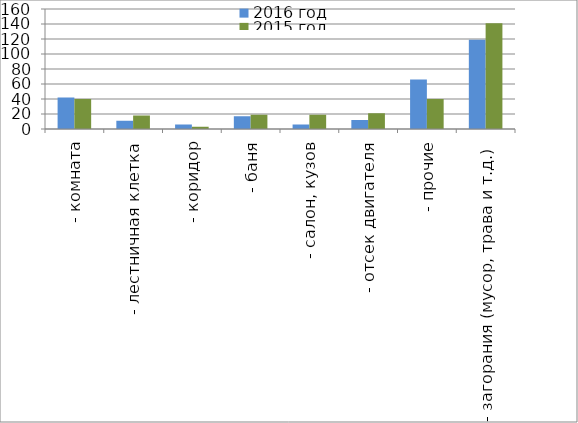
| Category | 2016 год | 2015 год |
|---|---|---|
|  - комната | 42 | 40 |
|  - лестничная клетка | 11 | 18 |
|  - коридор | 6 | 3 |
|  - баня | 17 | 19 |
|  - салон, кузов | 6 | 19 |
|  - отсек двигателя | 12 | 21 |
| - прочие | 66 | 40 |
| - загорания (мусор, трава и т.д.)  | 119 | 141 |